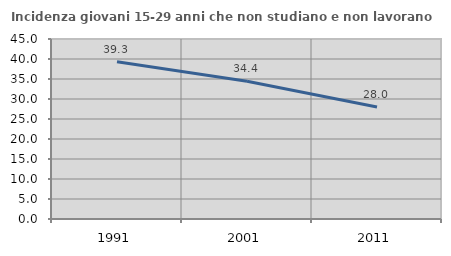
| Category | Incidenza giovani 15-29 anni che non studiano e non lavorano  |
|---|---|
| 1991.0 | 39.316 |
| 2001.0 | 34.449 |
| 2011.0 | 27.995 |